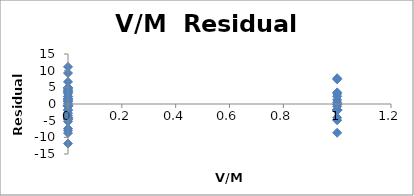
| Category | Series 0 |
|---|---|
| 0.0 | 1.352 |
| 0.0 | 0.865 |
| 0.0 | -3.506 |
| 0.0 | -5.266 |
| 0.0 | -7.375 |
| 0.0 | 4.266 |
| 0.0 | -7.895 |
| 1.0 | 1.269 |
| 1.0 | -0.067 |
| 1.0 | -8.634 |
| 0.0 | 0.714 |
| 0.0 | 1.679 |
| 0.0 | 3.644 |
| 0.0 | 3.929 |
| 0.0 | 2.318 |
| 0.0 | -0.532 |
| 0.0 | -1.904 |
| 0.0 | -4.718 |
| 0.0 | 3.14 |
| 0.0 | 6.653 |
| 0.0 | -0.318 |
| 0.0 | 4.92 |
| 0.0 | -0.558 |
| 0.0 | -1.709 |
| 0.0 | 4.644 |
| 0.0 | 0.211 |
| 0.0 | 1.653 |
| 0.0 | 1.494 |
| 1.0 | -1.917 |
| 0.0 | -4.151 |
| 0.0 | -2.754 |
| 0.0 | -8.709 |
| 0.0 | -4.328 |
| 1.0 | -1.942 |
| 1.0 | -4.093 |
| 1.0 | -1.669 |
| 1.0 | 3.084 |
| 1.0 | 7.375 |
| 1.0 | -1.695 |
| 1.0 | 3.483 |
| 1.0 | 0.526 |
| 0.0 | 11.141 |
| 0.0 | -0.401 |
| 0.0 | 0.929 |
| 0.0 | 4.919 |
| 0.0 | -4.542 |
| 1.0 | -0.128 |
| 1.0 | 2.314 |
| 1.0 | -4.872 |
| 1.0 | -0.077 |
| 0.0 | 3.689 |
| 0.0 | -11.869 |
| 1.0 | -0.686 |
| 0.0 | -0.683 |
| 0.0 | 2.221 |
| 0.0 | 9.282 |
| 0.0 | -0.674 |
| 0.0 | -0.603 |
| 0.0 | -0.629 |
| 0.0 | 3.618 |
| 1.0 | 7.728 |
| 0.0 | -4.157 |